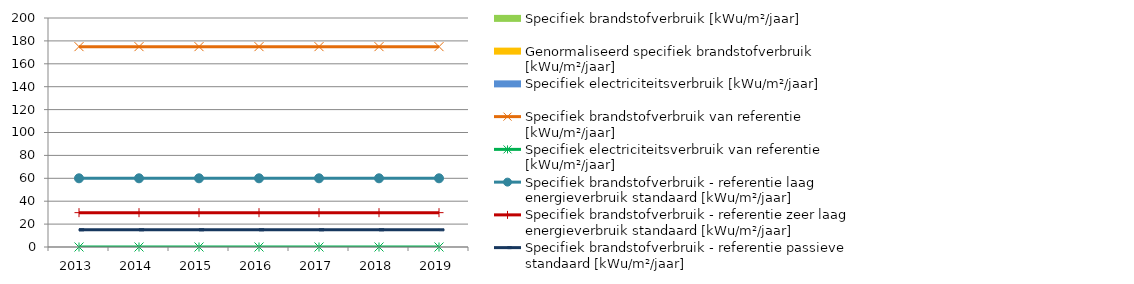
| Category | Specifiek brandstofverbruik [kWu/m²/jaar]
 | Genormaliseerd specifiek brandstofverbruik [kWu/m²/jaar]

 | Specifiek electriciteitsverbruik [kWu/m²/jaar]

 |
|---|---|---|---|
| 2013.0 | 0 | 0 | 0 |
| 2014.0 | 0 | 0 | 0 |
| 2015.0 | 0 | 0 | 0 |
| 2016.0 | 0 | 0 | 0 |
| 2017.0 | 0 | 0 | 0 |
| 2018.0 | 0 | 0 | 0 |
| 2019.0 | 0 | 0 | 0 |